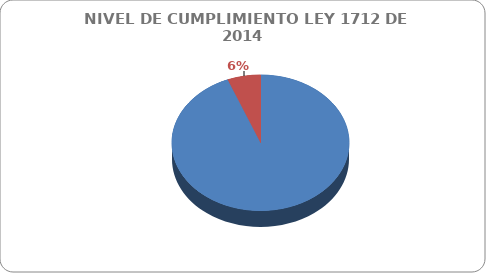
| Category | Series 0 |
|---|---|
|  CUMPLIDOS | 109 |
| NO CUMPLIDOS | 7 |